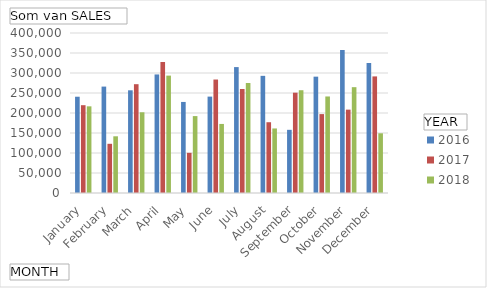
| Category | 2016 | 2017 | 2018 |
|---|---|---|---|
| January | 240687 | 219525 | 216662 |
| February | 266023 | 123001 | 141742 |
| March | 256731 | 272037 | 201846 |
| April | 296386 | 327643 | 293456 |
| May | 227636 | 100392 | 192275 |
| June | 240971 | 283694 | 172646 |
| July | 314783 | 260025 | 274943 |
| August | 292884 | 176936 | 161371 |
| September | 157943 | 250782 | 256938 |
| October | 290845 | 197254 | 241314 |
| November | 357811 | 208388 | 264561 |
| December | 324863 | 291479 | 149224 |